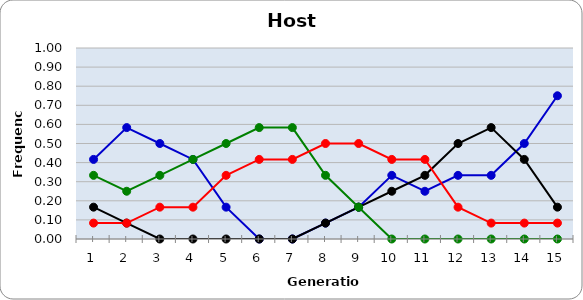
| Category | Sp | Cl | Di | He |
|---|---|---|---|---|
| 1.0 | 0.417 | 0.167 | 0.333 | 0.083 |
| 2.0 | 0.583 | 0.083 | 0.25 | 0.083 |
| 3.0 | 0.5 | 0 | 0.333 | 0.167 |
| 4.0 | 0.417 | 0 | 0.417 | 0.167 |
| 5.0 | 0.167 | 0 | 0.5 | 0.333 |
| 6.0 | 0 | 0 | 0.583 | 0.417 |
| 7.0 | 0 | 0 | 0.583 | 0.417 |
| 8.0 | 0.083 | 0.083 | 0.333 | 0.5 |
| 9.0 | 0.167 | 0.167 | 0.167 | 0.5 |
| 10.0 | 0.333 | 0.25 | 0 | 0.417 |
| 11.0 | 0.25 | 0.333 | 0 | 0.417 |
| 12.0 | 0.333 | 0.5 | 0 | 0.167 |
| 13.0 | 0.333 | 0.583 | 0 | 0.083 |
| 14.0 | 0.5 | 0.417 | 0 | 0.083 |
| 15.0 | 0.75 | 0.167 | 0 | 0.083 |